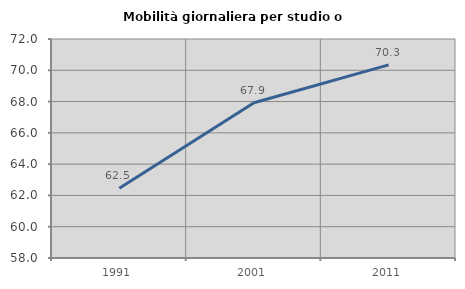
| Category | Mobilità giornaliera per studio o lavoro |
|---|---|
| 1991.0 | 62.461 |
| 2001.0 | 67.923 |
| 2011.0 | 70.344 |